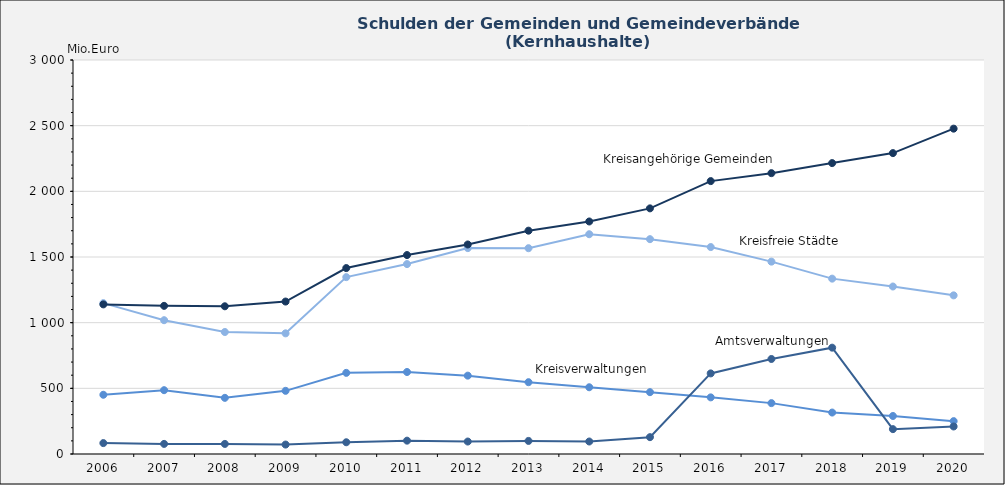
| Category | Kreisfreie Städte | Kreisverwaltungen | Kreisangehörige Gemeinden | Amtsverwaltungen |
|---|---|---|---|---|
| 2006-12-31 | 1148.685 | 450.971 | 1139.214 | 83.081 |
| 2007-12-31 | 1018.794 | 485.901 | 1128.09 | 77 |
| 2008-12-31 | 928.828 | 427.549 | 1124.734 | 76.656 |
| 2009-12-31 | 918.749 | 480.95 | 1160.738 | 71.858 |
| 2010-12-31 | 1346.654 | 617.803 | 1415.752 | 89.365 |
| 2011-12-31 | 1446.028 | 624.355 | 1514.709 | 101.622 |
| 2012-12-31 | 1567.827 | 596.621 | 1595.296 | 94.863 |
| 2013-12-31 | 1567.065 | 546.789 | 1700.382 | 99.561 |
| 2014-12-31 | 1673.41 | 508.158 | 1770.478 | 95.114 |
| 2015-12-31 | 1635.756 | 470.812 | 1870.25 | 128.185 |
| 2016-12-31 | 1575.737 | 431.207 | 2077.928 | 613.663 |
| 2017-12-31 | 1464.706 | 387.405 | 2138.452 | 723.458 |
| 2018-12-31 | 1335.215 | 315.614 | 2214.98 | 809.631 |
| 2019-12-31 | 1275.332 | 289.427 | 2291.036 | 189.311 |
| 2020-12-31 | 1207.887 | 250.246 | 2477.209 | 209.579 |